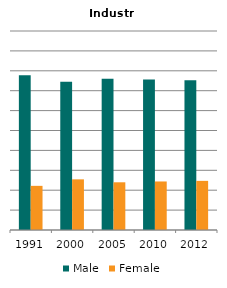
| Category | Male | Female |
|---|---|---|
| 1991.0 | 0.778 | 0.222 |
| 2000.0 | 0.745 | 0.255 |
| 2005.0 | 0.76 | 0.24 |
| 2010.0 | 0.756 | 0.244 |
| 2012.0 | 0.753 | 0.247 |